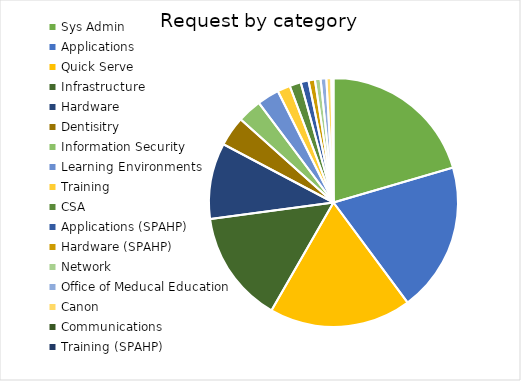
| Category | Series 0 |
|---|---|
| Sys Admin | 222 |
| Applications | 210 |
| Quick Serve | 200 |
| Infrastructure | 158 |
| Hardware | 107 |
| Dentisitry | 42 |
| Information Security | 34 |
| Learning Environments | 31 |
| Training | 18 |
| CSA | 16 |
| Applications (SPAHP) | 11 |
| Hardware (SPAHP) | 9 |
| Network | 8 |
| Office of Meducal Education | 8 |
| Canon | 7 |
| Communications | 2 |
| Training (SPAHP) | 1 |